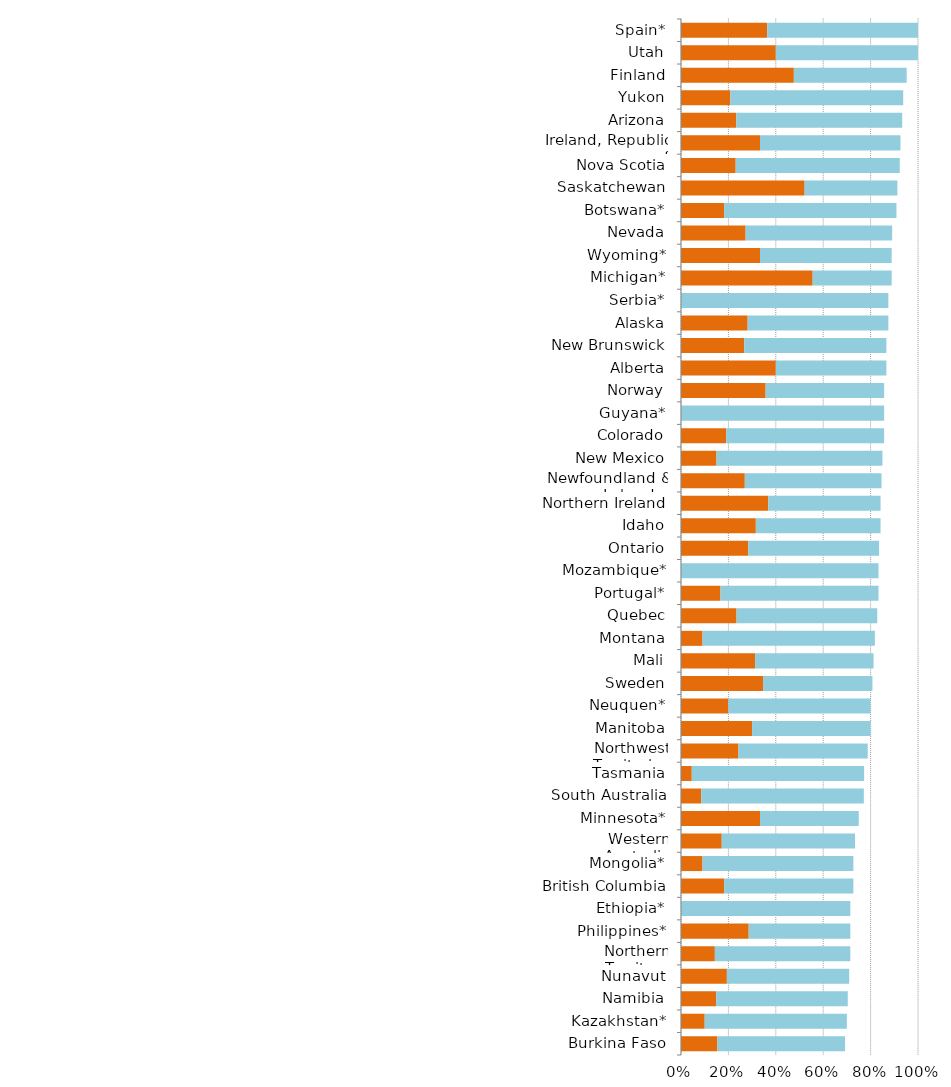
| Category | Series 0 | Series 1 |
|---|---|---|
| Burkina Faso | 0.154 | 0.538 |
| Kazakhstan* | 0.1 | 0.6 |
| Namibia | 0.148 | 0.556 |
| Nunavut | 0.194 | 0.516 |
| Northern Territory | 0.143 | 0.571 |
| Philippines* | 0.286 | 0.429 |
| Ethiopia* | 0 | 0.714 |
| British Columbia | 0.182 | 0.545 |
| Mongolia* | 0.091 | 0.636 |
| Western Australia | 0.172 | 0.562 |
| Minnesota* | 0.333 | 0.417 |
| South Australia | 0.086 | 0.686 |
| Tasmania | 0.045 | 0.727 |
| Northwest Territories | 0.242 | 0.545 |
| Manitoba | 0.3 | 0.5 |
| Neuquen* | 0.2 | 0.6 |
| Sweden | 0.346 | 0.462 |
| Mali | 0.312 | 0.5 |
| Montana | 0.091 | 0.727 |
| Quebec | 0.234 | 0.594 |
| Portugal* | 0.167 | 0.667 |
| Mozambique* | 0 | 0.833 |
| Ontario | 0.284 | 0.552 |
| Idaho | 0.316 | 0.526 |
| Northern Ireland | 0.368 | 0.474 |
| Newfoundland & Labrador | 0.269 | 0.577 |
| New Mexico | 0.15 | 0.7 |
| Colorado | 0.19 | 0.667 |
| Guyana* | 0 | 0.857 |
| Norway | 0.357 | 0.5 |
| Alberta | 0.4 | 0.467 |
| New Brunswick | 0.267 | 0.6 |
| Alaska | 0.281 | 0.594 |
| Serbia* | 0 | 0.875 |
| Michigan* | 0.556 | 0.333 |
| Wyoming* | 0.333 | 0.556 |
| Nevada | 0.273 | 0.618 |
| Botswana* | 0.182 | 0.727 |
| Saskatchewan | 0.522 | 0.391 |
| Nova Scotia | 0.231 | 0.692 |
| Ireland, Republic of | 0.333 | 0.593 |
| Arizona | 0.233 | 0.7 |
| Yukon | 0.208 | 0.729 |
| Finland | 0.476 | 0.476 |
| Utah | 0.4 | 0.6 |
| Spain* | 0.364 | 0.636 |